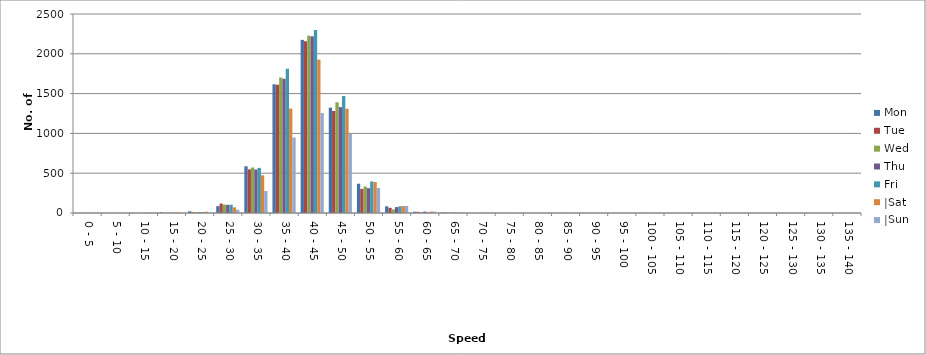
| Category | Mon | Tue | Wed | Thu | Fri | |Sat | |Sun |
|---|---|---|---|---|---|---|---|
| 0 - 5 | 1 | 0 | 0 | 2 | 0 | 0 | 0 |
| 5 - 10 | 0 | 0 | 0 | 1 | 0 | 0 | 0 |
| 10 - 15 | 2 | 0 | 2 | 1 | 1 | 4 | 0 |
| 15 - 20 | 8 | 0 | 3 | 2 | 1 | 6 | 0 |
| 20 - 25 | 21 | 10 | 9 | 9 | 11 | 16 | 2 |
| 25 - 30 | 86 | 118 | 105 | 103 | 103 | 71 | 41 |
| 30 - 35 | 587 | 548 | 571 | 547 | 567 | 473 | 277 |
| 35 - 40 | 1617 | 1612 | 1701 | 1686 | 1813 | 1312 | 948 |
| 40 - 45 | 2175 | 2157 | 2228 | 2219 | 2298 | 1927 | 1256 |
| 45 - 50 | 1323 | 1282 | 1391 | 1330 | 1469 | 1310 | 994 |
| 50 - 55 | 368 | 303 | 332 | 312 | 396 | 389 | 315 |
| 55 - 60 | 84 | 65 | 45 | 74 | 84 | 87 | 89 |
| 60 - 65 | 16 | 14 | 7 | 17 | 9 | 18 | 17 |
| 65 - 70 | 7 | 4 | 2 | 4 | 3 | 4 | 5 |
| 70 - 75 | 1 | 0 | 0 | 0 | 2 | 2 | 0 |
| 75 - 80 | 0 | 0 | 0 | 0 | 0 | 0 | 1 |
| 80 - 85 | 0 | 0 | 0 | 0 | 0 | 0 | 3 |
| 85 - 90 | 0 | 0 | 0 | 2 | 0 | 0 | 0 |
| 90 - 95 | 0 | 0 | 0 | 0 | 0 | 0 | 0 |
| 95 - 100 | 0 | 0 | 0 | 0 | 0 | 0 | 0 |
| 100 - 105 | 0 | 2 | 0 | 0 | 0 | 0 | 0 |
| 105 - 110 | 0 | 0 | 0 | 0 | 0 | 0 | 0 |
| 110 - 115 | 0 | 0 | 0 | 0 | 0 | 0 | 0 |
| 115 - 120 | 0 | 0 | 0 | 0 | 0 | 0 | 0 |
| 120 - 125 | 0 | 0 | 0 | 0 | 0 | 0 | 0 |
| 125 - 130 | 0 | 0 | 0 | 0 | 0 | 0 | 0 |
| 130 - 135 | 0 | 0 | 0 | 0 | 0 | 0 | 0 |
| 135 - 140 | 0 | 0 | 0 | 0 | 0 | 0 | 0 |